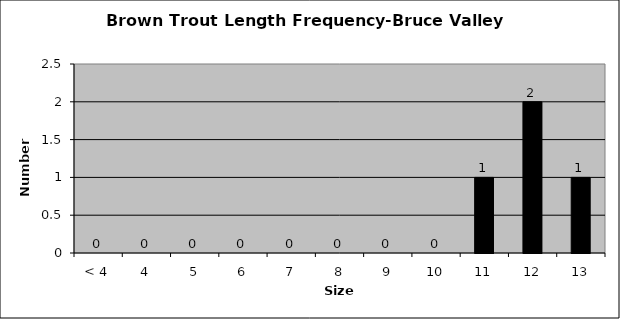
| Category | Series 0 |
|---|---|
| < 4 | 0 |
| 4 | 0 |
| 5 | 0 |
| 6 | 0 |
| 7 | 0 |
| 8 | 0 |
| 9 | 0 |
| 10 | 0 |
| 11 | 1 |
| 12 | 2 |
| 13 | 1 |